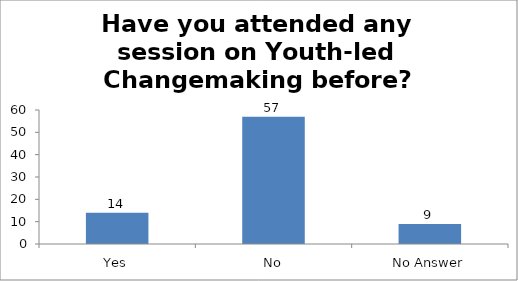
| Category | Have you attended any session on Youth-led Changemaking before? |
|---|---|
| Yes | 14 |
| No | 57 |
| No Answer | 9 |